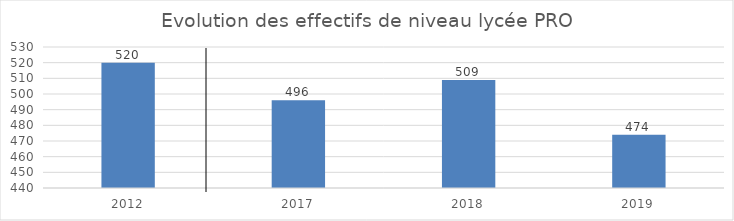
| Category | Series 0 |
|---|---|
| 2012.0 | 520 |
| 2017.0 | 496 |
| 2018.0 | 509 |
| 2019.0 | 474 |